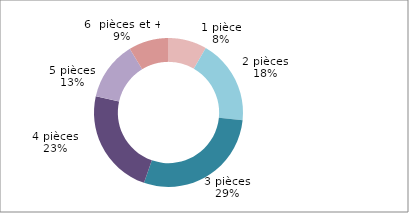
| Category | 2022 |
|---|---|
| 1 pièce | 36091 |
| 2 pièces | 79210 |
| 3 pièces | 124259 |
| 4 pièces | 100373 |
| 5 pièces | 55374 |
| 6  pièces et + | 37634 |